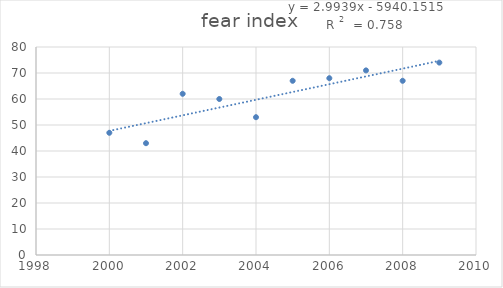
| Category | fear index |
|---|---|
| 2000.0 | 47 |
| 2001.0 | 43 |
| 2002.0 | 62 |
| 2003.0 | 60 |
| 2004.0 | 53 |
| 2005.0 | 67 |
| 2006.0 | 68 |
| 2007.0 | 71 |
| 2008.0 | 67 |
| 2009.0 | 74 |